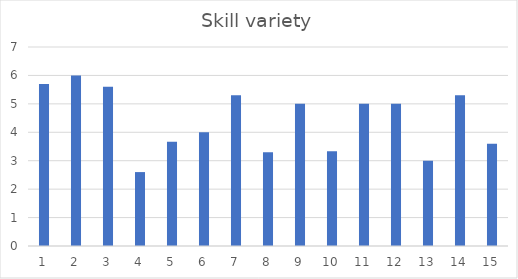
| Category | Skill variety |
|---|---|
| 0 | 5.7 |
| 1 | 6 |
| 2 | 5.6 |
| 3 | 2.6 |
| 4 | 3.67 |
| 5 | 4 |
| 6 | 5.3 |
| 7 | 3.3 |
| 8 | 5 |
| 9 | 3.33 |
| 10 | 5 |
| 11 | 5 |
| 12 | 3 |
| 13 | 5.3 |
| 14 | 3.6 |